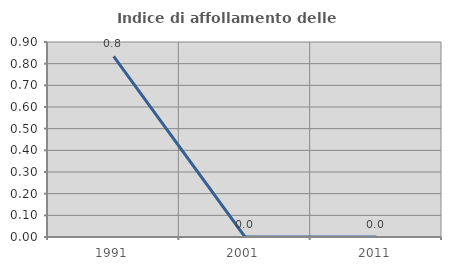
| Category | Indice di affollamento delle abitazioni  |
|---|---|
| 1991.0 | 0.833 |
| 2001.0 | 0 |
| 2011.0 | 0 |